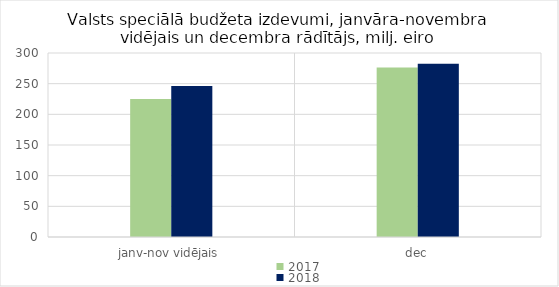
| Category | 2017 | 2018 |
|---|---|---|
| janv-nov vidējais | 224960.939 | 246381.742 |
| dec | 276195.004 | 282446.284 |